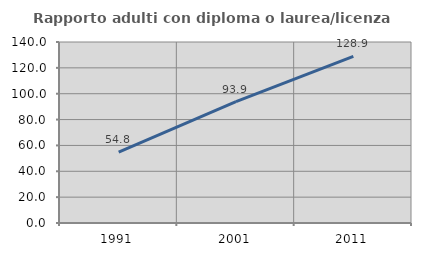
| Category | Rapporto adulti con diploma o laurea/licenza media  |
|---|---|
| 1991.0 | 54.841 |
| 2001.0 | 93.86 |
| 2011.0 | 128.904 |